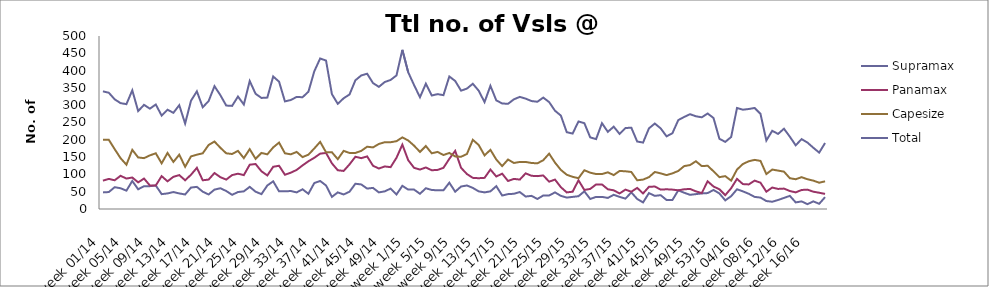
| Category | Supramax | Panamax | Capesize | Total |
|---|---|---|---|---|
| week 01/14 | 48 | 82 | 200 | 340 |
| week 02/14 | 49 | 87 | 200 | 336 |
| week 03/14 | 63 | 83 | 173 | 317 |
| week 04/14 | 60 | 96 | 147 | 306 |
| week 05/14 | 53 | 88 | 128 | 303 |
| week 06/14 | 81 | 91 | 171 | 343 |
| week 07/14 | 57 | 77 | 149 | 283 |
| week 08/14 | 66 | 88 | 147 | 301 |
| week 09/14 | 66 | 68 | 155 | 290 |
| week 10/14 | 68 | 68 | 161 | 302 |
| week 11/14 | 43 | 95 | 132 | 270 |
| week 12/14 | 45 | 80 | 162 | 287 |
| week 13/14 | 49 | 93 | 136 | 278 |
| week 14/14 | 45 | 98 | 157 | 300 |
| week 15/14 | 42 | 83 | 122 | 247 |
| week 16/14 | 62 | 99 | 152 | 313 |
| week 17/14 | 64 | 119 | 157 | 340 |
| week 18/14 | 50 | 83 | 161 | 294 |
| week 19/14 | 42 | 85 | 185 | 312 |
| week 20/14 | 56 | 104 | 195 | 355 |
| week 21/14 | 60 | 92 | 177 | 329 |
| week 22/14 | 52 | 85 | 161 | 299 |
| week 23/14 | 41 | 98 | 159 | 298 |
| week 24/14 | 49 | 102 | 168 | 325 |
| week 25/14 | 51 | 98 | 147 | 302 |
| week 26/14 | 64 | 128 | 173 | 370 |
| week 27/14 | 50 | 130 | 145 | 333 |
| week 28/14 | 43 | 109 | 162 | 321 |
| week 29/14 | 68 | 97 | 158 | 322 |
| week 30/14 | 80 | 122 | 178 | 383 |
| week 31/14 | 51 | 125 | 192 | 368 |
| week 32/14 | 51 | 99 | 161 | 311 |
| week 33/14 | 52 | 105 | 158 | 315 |
| week 34/14 | 48 | 113 | 165 | 324 |
| week 35/14 | 57 | 126 | 150 | 323 |
| week 36/14 | 44 | 138 | 157 | 339 |
| week 37/14 | 75 | 148 | 175 | 398 |
| week 38/14 | 81 | 160 | 194 | 435 |
| week 39/14 | 68 | 162 | 164 | 429 |
| week 40/14 | 35 | 132 | 164 | 332 |
| week 41/14 | 48 | 112 | 144 | 304 |
| week 42/14 | 42 | 110 | 168 | 320 |
| week 43/14 | 50 | 129 | 162 | 331 |
| week 44/14 | 73 | 151 | 162 | 372 |
| week 45/14 | 71 | 147 | 168 | 386 |
| week 46/14 | 59 | 152 | 180 | 391 |
| week 47/14 | 61 | 125 | 178 | 364 |
| week 48/14 | 48 | 117 | 188 | 353 |
| week 49/14 | 51 | 123 | 193 | 367 |
| week 50/14 | 59 | 121 | 193 | 373 |
| week 51/14 | 42 | 148 | 196 | 386 |
| week 52/14 | 67 | 186 | 207 | 460 |
| week 1/15 | 56 | 141 | 198 | 395 |
| week 2/15 | 56 | 119 | 183 | 358 |
| week 3/15 | 44 | 114 | 165 | 323 |
| week 4/15 | 60 | 120 | 182 | 362 |
| week 5/15 | 55 | 112 | 161 | 328 |
| week 6/15 | 54 | 113 | 165 | 332 |
| week 7/15 | 54 | 119 | 156 | 329 |
| week 8/15 | 76 | 145 | 162 | 383 |
| week 9/15 | 50 | 168 | 152 | 370 |
| week 10/15 | 65 | 119 | 151 | 342 |
| week 11/15 | 68 | 101 | 159 | 348 |
| week 12/15 | 61 | 90 | 200 | 362 |
| week 13/15 | 51 | 89 | 185 | 342 |
| week 14/15 | 48 | 90 | 155 | 309 |
| week 15/15 | 51 | 114 | 171 | 356 |
| week 16/15 | 66 | 94 | 143 | 314 |
| week 17/15 | 39 | 102 | 124 | 305 |
| week 18/15 | 43 | 81 | 143 | 304 |
| week 19/15 | 44 | 87 | 133 | 317 |
| week 20/15 | 49 | 85 | 136 | 324 |
| week 21/15 | 36 | 103 | 136 | 319 |
| week 22/15 | 38 | 96 | 133 | 312 |
| week 23/15 | 29 | 95 | 132 | 310 |
| week 24/15 | 39 | 97 | 141 | 322 |
| week 25/15 | 39 | 79 | 160 | 309 |
| week 26/15 | 48 | 85 | 134 | 284 |
| week 27/15 | 38 | 63 | 113 | 270 |
| week 28/15 | 33 | 48 | 99 | 222 |
| week 29/15 | 35 | 50 | 93 | 218 |
| week 30/15 | 37 | 83 | 89 | 253 |
| week 31/15 | 51 | 55 | 112 | 248 |
| week 32/15 | 29 | 58 | 105 | 207 |
| week 33/15 | 35 | 71 | 101 | 202 |
| week 34/15 | 35 | 71 | 101 | 248 |
| week 35/15 | 32 | 57 | 106 | 223 |
| week 36/15 | 41 | 54 | 98 | 238 |
| week 37/15 | 35 | 45 | 110 | 217 |
| week 38/15 | 30 | 56 | 109 | 234 |
| week 39/15 | 48 | 50 | 107 | 235 |
| week 40/15 | 29 | 61 | 83 | 195 |
| week 41/15 | 19 | 45 | 85 | 192 |
| week 42/15 | 46 | 64 | 92 | 233 |
| week 43/15 | 38 | 65 | 107 | 247 |
| week 44/15 | 40 | 56 | 103 | 233 |
| week 45/15 | 26 | 57 | 98 | 210 |
| week 46/15 | 26 | 56 | 103 | 219 |
| week 47/15 | 54 | 54 | 110 | 257 |
| week 48/15 | 47 | 57 | 124 | 266 |
| week 49/15 | 41 | 58 | 127 | 274 |
| week 50/15 | 43 | 51 | 138 | 268 |
| week 51/15 | 45 | 46 | 124 | 265 |
| week 52/15 | 46 | 80 | 125 | 276 |
| week 53/15 | 55 | 65 | 109 | 263 |
| week 01/16 | 45 | 57 | 92 | 203 |
| week 02/16 | 25 | 40 | 95 | 194 |
| week 03/16 | 37 | 60 | 82 | 208 |
| week 04/16 | 57 | 87 | 114 | 292 |
| week 05/16 | 51 | 72 | 130 | 287 |
| week 06/16 | 44 | 71 | 138 | 289 |
| week 07/16 | 35 | 82 | 142 | 292 |
| week 08/16 | 33 | 76 | 139 | 275 |
| week 09/16 | 23 | 50 | 101 | 198 |
| week 10/16 | 21 | 62 | 114 | 226 |
| week 11/16 | 26 | 58 | 111 | 217 |
| week 12/16 | 32 | 59 | 108 | 232 |
| week 13/16 | 38 | 52 | 89 | 209 |
| week 14/16 | 19 | 48 | 86 | 184 |
| week 15/16 | 22 | 55 | 92 | 202 |
| week 16/16 | 14 | 56 | 86 | 192 |
| week 17/16 | 22 | 50 | 82 | 177 |
| week 18/16 | 15 | 47 | 76 | 163 |
| week 19/16 | 34.333 | 43.625 | 80 | 190.737 |